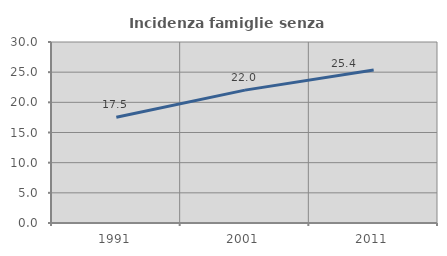
| Category | Incidenza famiglie senza nuclei |
|---|---|
| 1991.0 | 17.53 |
| 2001.0 | 22.023 |
| 2011.0 | 25.357 |